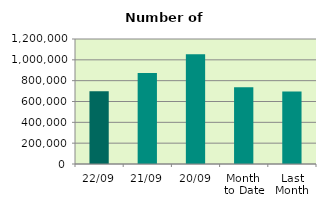
| Category | Series 0 |
|---|---|
| 22/09 | 697618 |
| 21/09 | 874462 |
| 20/09 | 1054576 |
| Month 
to Date | 736596.625 |
| Last
Month | 695004.455 |